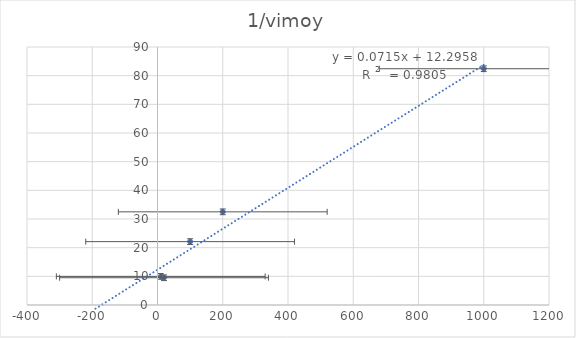
| Category | 1/vimoy |
|---|---|
| 1000.0 | 82.421 |
| 200.0 | 32.501 |
| 100.0 | 22.106 |
| 20.0 | 9.514 |
| 10.0 | 9.979 |